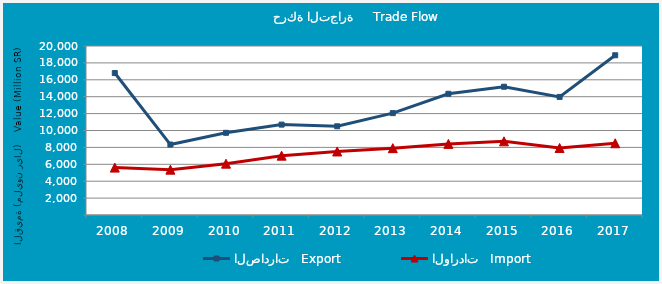
| Category | الصادرات   Export | الواردات   Import |
|---|---|---|
| 2008.0 | 16799335317 | 5611681105 |
| 2009.0 | 8335999723 | 5364648878 |
| 2010.0 | 9725273788 | 6074346837 |
| 2011.0 | 10696326452 | 7021428900 |
| 2012.0 | 10498368354 | 7520003661 |
| 2013.0 | 12055552707 | 7909428723 |
| 2014.0 | 14344174823 | 8413949875 |
| 2015.0 | 15181185189 | 8719394321 |
| 2016.0 | 13974163121 | 7932570482 |
| 2017.0 | 18901709825 | 8492303585 |